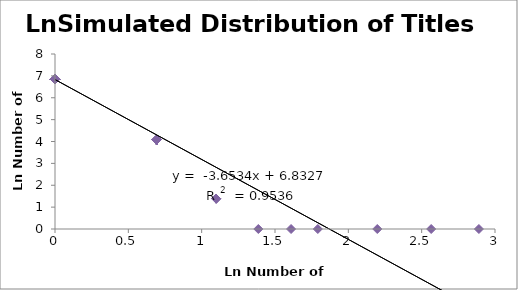
| Category | LnSimulated Number of Athletes |
|---|---|
| 2.8903717578961645 | 0 |
| 2.5649493574615367 | 0 |
| 2.1972245773362196 | 0 |
| 1.791759469228055 | 0 |
| 1.6094379124341003 | 0 |
| 1.3862943611198906 | 0 |
| 1.0986122886681098 | 1.386 |
| 1.0986122886681098 | 1.386 |
| 1.0986122886681098 | 1.386 |
| 1.0986122886681098 | 1.386 |
| 0.6931471805599453 | 4.078 |
| 0.6931471805599453 | 4.078 |
| 0.6931471805599453 | 4.078 |
| 0.6931471805599453 | 4.078 |
| 0.6931471805599453 | 4.078 |
| 0.6931471805599453 | 4.078 |
| 0.6931471805599453 | 4.078 |
| 0.6931471805599453 | 4.078 |
| 0.6931471805599453 | 4.078 |
| 0.6931471805599453 | 4.078 |
| 0.6931471805599453 | 4.078 |
| 0.6931471805599453 | 4.078 |
| 0.6931471805599453 | 4.078 |
| 0.6931471805599453 | 4.078 |
| 0.6931471805599453 | 4.078 |
| 0.6931471805599453 | 4.078 |
| 0.6931471805599453 | 4.078 |
| 0.6931471805599453 | 4.078 |
| 0.6931471805599453 | 4.078 |
| 0.6931471805599453 | 4.078 |
| 0.6931471805599453 | 4.078 |
| 0.6931471805599453 | 4.078 |
| 0.6931471805599453 | 4.078 |
| 0.6931471805599453 | 4.078 |
| 0.6931471805599453 | 4.078 |
| 0.6931471805599453 | 4.078 |
| 0.6931471805599453 | 4.078 |
| 0.6931471805599453 | 4.078 |
| 0.6931471805599453 | 4.078 |
| 0.6931471805599453 | 4.078 |
| 0.6931471805599453 | 4.078 |
| 0.6931471805599453 | 4.078 |
| 0.6931471805599453 | 4.078 |
| 0.6931471805599453 | 4.078 |
| 0.6931471805599453 | 4.078 |
| 0.6931471805599453 | 4.078 |
| 0.6931471805599453 | 4.078 |
| 0.6931471805599453 | 4.078 |
| 0.6931471805599453 | 4.078 |
| 0.6931471805599453 | 4.078 |
| 0.6931471805599453 | 4.078 |
| 0.6931471805599453 | 4.078 |
| 0.6931471805599453 | 4.078 |
| 0.6931471805599453 | 4.078 |
| 0.6931471805599453 | 4.078 |
| 0.6931471805599453 | 4.078 |
| 0.6931471805599453 | 4.078 |
| 0.6931471805599453 | 4.078 |
| 0.6931471805599453 | 4.078 |
| 0.6931471805599453 | 4.078 |
| 0.6931471805599453 | 4.078 |
| 0.6931471805599453 | 4.078 |
| 0.6931471805599453 | 4.078 |
| 0.6931471805599453 | 4.078 |
| 0.6931471805599453 | 4.078 |
| 0.6931471805599453 | 4.078 |
| 0.6931471805599453 | 4.078 |
| 0.6931471805599453 | 4.078 |
| 0.6931471805599453 | 4.078 |
| 0.0 | 6.848 |
| 0.0 | 6.848 |
| 0.0 | 6.848 |
| 0.0 | 6.848 |
| 0.0 | 6.848 |
| 0.0 | 6.848 |
| 0.0 | 6.848 |
| 0.0 | 6.848 |
| 0.0 | 6.848 |
| 0.0 | 6.848 |
| 0.0 | 6.848 |
| 0.0 | 6.848 |
| 0.0 | 6.848 |
| 0.0 | 6.848 |
| 0.0 | 6.848 |
| 0.0 | 6.848 |
| 0.0 | 6.848 |
| 0.0 | 6.848 |
| 0.0 | 6.848 |
| 0.0 | 6.848 |
| 0.0 | 6.848 |
| 0.0 | 6.848 |
| 0.0 | 6.848 |
| 0.0 | 6.848 |
| 0.0 | 6.848 |
| 0.0 | 6.848 |
| 0.0 | 6.848 |
| 0.0 | 6.848 |
| 0.0 | 6.848 |
| 0.0 | 6.848 |
| 0.0 | 6.848 |
| 0.0 | 6.848 |
| 0.0 | 6.848 |
| 0.0 | 6.848 |
| 0.0 | 6.848 |
| 0.0 | 6.848 |
| 0.0 | 6.848 |
| 0.0 | 6.848 |
| 0.0 | 6.848 |
| 0.0 | 6.848 |
| 0.0 | 6.848 |
| 0.0 | 6.848 |
| 0.0 | 6.848 |
| 0.0 | 6.848 |
| 0.0 | 6.848 |
| 0.0 | 6.848 |
| 0.0 | 6.848 |
| 0.0 | 6.848 |
| 0.0 | 6.848 |
| 0.0 | 6.848 |
| 0.0 | 6.848 |
| 0.0 | 6.848 |
| 0.0 | 6.848 |
| 0.0 | 6.848 |
| 0.0 | 6.848 |
| 0.0 | 6.848 |
| 0.0 | 6.848 |
| 0.0 | 6.848 |
| 0.0 | 6.848 |
| 0.0 | 6.848 |
| 0.0 | 6.848 |
| 0.0 | 6.848 |
| 0.0 | 6.848 |
| 0.0 | 6.848 |
| 0.0 | 6.848 |
| 0.0 | 6.848 |
| 0.0 | 6.848 |
| 0.0 | 6.848 |
| 0.0 | 6.848 |
| 0.0 | 6.848 |
| 0.0 | 6.848 |
| 0.0 | 6.848 |
| 0.0 | 6.848 |
| 0.0 | 6.848 |
| 0.0 | 6.848 |
| 0.0 | 6.848 |
| 0.0 | 6.848 |
| 0.0 | 6.848 |
| 0.0 | 6.848 |
| 0.0 | 6.848 |
| 0.0 | 6.848 |
| 0.0 | 6.848 |
| 0.0 | 6.848 |
| 0.0 | 6.848 |
| 0.0 | 6.848 |
| 0.0 | 6.848 |
| 0.0 | 6.848 |
| 0.0 | 6.848 |
| 0.0 | 6.848 |
| 0.0 | 6.848 |
| 0.0 | 6.848 |
| 0.0 | 6.848 |
| 0.0 | 6.848 |
| 0.0 | 6.848 |
| 0.0 | 6.848 |
| 0.0 | 6.848 |
| 0.0 | 6.848 |
| 0.0 | 6.848 |
| 0.0 | 6.848 |
| 0.0 | 6.848 |
| 0.0 | 6.848 |
| 0.0 | 6.848 |
| 0.0 | 6.848 |
| 0.0 | 6.848 |
| 0.0 | 6.848 |
| 0.0 | 6.848 |
| 0.0 | 6.848 |
| 0.0 | 6.848 |
| 0.0 | 6.848 |
| 0.0 | 6.848 |
| 0.0 | 6.848 |
| 0.0 | 6.848 |
| 0.0 | 6.848 |
| 0.0 | 6.848 |
| 0.0 | 6.848 |
| 0.0 | 6.848 |
| 0.0 | 6.848 |
| 0.0 | 6.848 |
| 0.0 | 6.848 |
| 0.0 | 6.848 |
| 0.0 | 6.848 |
| 0.0 | 6.848 |
| 0.0 | 6.848 |
| 0.0 | 6.848 |
| 0.0 | 6.848 |
| 0.0 | 6.848 |
| 0.0 | 6.848 |
| 0.0 | 6.848 |
| 0.0 | 6.848 |
| 0.0 | 6.848 |
| 0.0 | 6.848 |
| 0.0 | 6.848 |
| 0.0 | 6.848 |
| 0.0 | 6.848 |
| 0.0 | 6.848 |
| 0.0 | 6.848 |
| 0.0 | 6.848 |
| 0.0 | 6.848 |
| 0.0 | 6.848 |
| 0.0 | 6.848 |
| 0.0 | 6.848 |
| 0.0 | 6.848 |
| 0.0 | 6.848 |
| 0.0 | 6.848 |
| 0.0 | 6.848 |
| 0.0 | 6.848 |
| 0.0 | 6.848 |
| 0.0 | 6.848 |
| 0.0 | 6.848 |
| 0.0 | 6.848 |
| 0.0 | 6.848 |
| 0.0 | 6.848 |
| 0.0 | 6.848 |
| 0.0 | 6.848 |
| 0.0 | 6.848 |
| 0.0 | 6.848 |
| 0.0 | 6.848 |
| 0.0 | 6.848 |
| 0.0 | 6.848 |
| 0.0 | 6.848 |
| 0.0 | 6.848 |
| 0.0 | 6.848 |
| 0.0 | 6.848 |
| 0.0 | 6.848 |
| 0.0 | 6.848 |
| 0.0 | 6.848 |
| 0.0 | 6.848 |
| 0.0 | 6.848 |
| 0.0 | 6.848 |
| 0.0 | 6.848 |
| 0.0 | 6.848 |
| 0.0 | 6.848 |
| 0.0 | 6.848 |
| 0.0 | 6.848 |
| 0.0 | 6.848 |
| 0.0 | 6.848 |
| 0.0 | 6.848 |
| 0.0 | 6.848 |
| 0.0 | 6.848 |
| 0.0 | 6.848 |
| 0.0 | 6.848 |
| 0.0 | 6.848 |
| 0.0 | 6.848 |
| 0.0 | 6.848 |
| 0.0 | 6.848 |
| 0.0 | 6.848 |
| 0.0 | 6.848 |
| 0.0 | 6.848 |
| 0.0 | 6.848 |
| 0.0 | 6.848 |
| 0.0 | 6.848 |
| 0.0 | 6.848 |
| 0.0 | 6.848 |
| 0.0 | 6.848 |
| 0.0 | 6.848 |
| 0.0 | 6.848 |
| 0.0 | 6.848 |
| 0.0 | 6.848 |
| 0.0 | 6.848 |
| 0.0 | 6.848 |
| 0.0 | 6.848 |
| 0.0 | 6.848 |
| 0.0 | 6.848 |
| 0.0 | 6.848 |
| 0.0 | 6.848 |
| 0.0 | 6.848 |
| 0.0 | 6.848 |
| 0.0 | 6.848 |
| 0.0 | 6.848 |
| 0.0 | 6.848 |
| 0.0 | 6.848 |
| 0.0 | 6.848 |
| 0.0 | 6.848 |
| 0.0 | 6.848 |
| 0.0 | 6.848 |
| 0.0 | 6.848 |
| 0.0 | 6.848 |
| 0.0 | 6.848 |
| 0.0 | 6.848 |
| 0.0 | 6.848 |
| 0.0 | 6.848 |
| 0.0 | 6.848 |
| 0.0 | 6.848 |
| 0.0 | 6.848 |
| 0.0 | 6.848 |
| 0.0 | 6.848 |
| 0.0 | 6.848 |
| 0.0 | 6.848 |
| 0.0 | 6.848 |
| 0.0 | 6.848 |
| 0.0 | 6.848 |
| 0.0 | 6.848 |
| 0.0 | 6.848 |
| 0.0 | 6.848 |
| 0.0 | 6.848 |
| 0.0 | 6.848 |
| 0.0 | 6.848 |
| 0.0 | 6.848 |
| 0.0 | 6.848 |
| 0.0 | 6.848 |
| 0.0 | 6.848 |
| 0.0 | 6.848 |
| 0.0 | 6.848 |
| 0.0 | 6.848 |
| 0.0 | 6.848 |
| 0.0 | 6.848 |
| 0.0 | 6.848 |
| 0.0 | 6.848 |
| 0.0 | 6.848 |
| 0.0 | 6.848 |
| 0.0 | 6.848 |
| 0.0 | 6.848 |
| 0.0 | 6.848 |
| 0.0 | 6.848 |
| 0.0 | 6.848 |
| 0.0 | 6.848 |
| 0.0 | 6.848 |
| 0.0 | 6.848 |
| 0.0 | 6.848 |
| 0.0 | 6.848 |
| 0.0 | 6.848 |
| 0.0 | 6.848 |
| 0.0 | 6.848 |
| 0.0 | 6.848 |
| 0.0 | 6.848 |
| 0.0 | 6.848 |
| 0.0 | 6.848 |
| 0.0 | 6.848 |
| 0.0 | 6.848 |
| 0.0 | 6.848 |
| 0.0 | 6.848 |
| 0.0 | 6.848 |
| 0.0 | 6.848 |
| 0.0 | 6.848 |
| 0.0 | 6.848 |
| 0.0 | 6.848 |
| 0.0 | 6.848 |
| 0.0 | 6.848 |
| 0.0 | 6.848 |
| 0.0 | 6.848 |
| 0.0 | 6.848 |
| 0.0 | 6.848 |
| 0.0 | 6.848 |
| 0.0 | 6.848 |
| 0.0 | 6.848 |
| 0.0 | 6.848 |
| 0.0 | 6.848 |
| 0.0 | 6.848 |
| 0.0 | 6.848 |
| 0.0 | 6.848 |
| 0.0 | 6.848 |
| 0.0 | 6.848 |
| 0.0 | 6.848 |
| 0.0 | 6.848 |
| 0.0 | 6.848 |
| 0.0 | 6.848 |
| 0.0 | 6.848 |
| 0.0 | 6.848 |
| 0.0 | 6.848 |
| 0.0 | 6.848 |
| 0.0 | 6.848 |
| 0.0 | 6.848 |
| 0.0 | 6.848 |
| 0.0 | 6.848 |
| 0.0 | 6.848 |
| 0.0 | 6.848 |
| 0.0 | 6.848 |
| 0.0 | 6.848 |
| 0.0 | 6.848 |
| 0.0 | 6.848 |
| 0.0 | 6.848 |
| 0.0 | 6.848 |
| 0.0 | 6.848 |
| 0.0 | 6.848 |
| 0.0 | 6.848 |
| 0.0 | 6.848 |
| 0.0 | 6.848 |
| 0.0 | 6.848 |
| 0.0 | 6.848 |
| 0.0 | 6.848 |
| 0.0 | 6.848 |
| 0.0 | 6.848 |
| 0.0 | 6.848 |
| 0.0 | 6.848 |
| 0.0 | 6.848 |
| 0.0 | 6.848 |
| 0.0 | 6.848 |
| 0.0 | 6.848 |
| 0.0 | 6.848 |
| 0.0 | 6.848 |
| 0.0 | 6.848 |
| 0.0 | 6.848 |
| 0.0 | 6.848 |
| 0.0 | 6.848 |
| 0.0 | 6.848 |
| 0.0 | 6.848 |
| 0.0 | 6.848 |
| 0.0 | 6.848 |
| 0.0 | 6.848 |
| 0.0 | 6.848 |
| 0.0 | 6.848 |
| 0.0 | 6.848 |
| 0.0 | 6.848 |
| 0.0 | 6.848 |
| 0.0 | 6.848 |
| 0.0 | 6.848 |
| 0.0 | 6.848 |
| 0.0 | 6.848 |
| 0.0 | 6.848 |
| 0.0 | 6.848 |
| 0.0 | 6.848 |
| 0.0 | 6.848 |
| 0.0 | 6.848 |
| 0.0 | 6.848 |
| 0.0 | 6.848 |
| 0.0 | 6.848 |
| 0.0 | 6.848 |
| 0.0 | 6.848 |
| 0.0 | 6.848 |
| 0.0 | 6.848 |
| 0.0 | 6.848 |
| 0.0 | 6.848 |
| 0.0 | 6.848 |
| 0.0 | 6.848 |
| 0.0 | 6.848 |
| 0.0 | 6.848 |
| 0.0 | 6.848 |
| 0.0 | 6.848 |
| 0.0 | 6.848 |
| 0.0 | 6.848 |
| 0.0 | 6.848 |
| 0.0 | 6.848 |
| 0.0 | 6.848 |
| 0.0 | 6.848 |
| 0.0 | 6.848 |
| 0.0 | 6.848 |
| 0.0 | 6.848 |
| 0.0 | 6.848 |
| 0.0 | 6.848 |
| 0.0 | 6.848 |
| 0.0 | 6.848 |
| 0.0 | 6.848 |
| 0.0 | 6.848 |
| 0.0 | 6.848 |
| 0.0 | 6.848 |
| 0.0 | 6.848 |
| 0.0 | 6.848 |
| 0.0 | 6.848 |
| 0.0 | 6.848 |
| 0.0 | 6.848 |
| 0.0 | 6.848 |
| 0.0 | 6.848 |
| 0.0 | 6.848 |
| 0.0 | 6.848 |
| 0.0 | 6.848 |
| 0.0 | 6.848 |
| 0.0 | 6.848 |
| 0.0 | 6.848 |
| 0.0 | 6.848 |
| 0.0 | 6.848 |
| 0.0 | 6.848 |
| 0.0 | 6.848 |
| 0.0 | 6.848 |
| 0.0 | 6.848 |
| 0.0 | 6.848 |
| 0.0 | 6.848 |
| 0.0 | 6.848 |
| 0.0 | 6.848 |
| 0.0 | 6.848 |
| 0.0 | 6.848 |
| 0.0 | 6.848 |
| 0.0 | 6.848 |
| 0.0 | 6.848 |
| 0.0 | 6.848 |
| 0.0 | 6.848 |
| 0.0 | 6.848 |
| 0.0 | 6.848 |
| 0.0 | 6.848 |
| 0.0 | 6.848 |
| 0.0 | 6.848 |
| 0.0 | 6.848 |
| 0.0 | 6.848 |
| 0.0 | 6.848 |
| 0.0 | 6.848 |
| 0.0 | 6.848 |
| 0.0 | 6.848 |
| 0.0 | 6.848 |
| 0.0 | 6.848 |
| 0.0 | 6.848 |
| 0.0 | 6.848 |
| 0.0 | 6.848 |
| 0.0 | 6.848 |
| 0.0 | 6.848 |
| 0.0 | 6.848 |
| 0.0 | 6.848 |
| 0.0 | 6.848 |
| 0.0 | 6.848 |
| 0.0 | 6.848 |
| 0.0 | 6.848 |
| 0.0 | 6.848 |
| 0.0 | 6.848 |
| 0.0 | 6.848 |
| 0.0 | 6.848 |
| 0.0 | 6.848 |
| 0.0 | 6.848 |
| 0.0 | 6.848 |
| 0.0 | 6.848 |
| 0.0 | 6.848 |
| 0.0 | 6.848 |
| 0.0 | 6.848 |
| 0.0 | 6.848 |
| 0.0 | 6.848 |
| 0.0 | 6.848 |
| 0.0 | 6.848 |
| 0.0 | 6.848 |
| 0.0 | 6.848 |
| 0.0 | 6.848 |
| 0.0 | 6.848 |
| 0.0 | 6.848 |
| 0.0 | 6.848 |
| 0.0 | 6.848 |
| 0.0 | 6.848 |
| 0.0 | 6.848 |
| 0.0 | 6.848 |
| 0.0 | 6.848 |
| 0.0 | 6.848 |
| 0.0 | 6.848 |
| 0.0 | 6.848 |
| 0.0 | 6.848 |
| 0.0 | 6.848 |
| 0.0 | 6.848 |
| 0.0 | 6.848 |
| 0.0 | 6.848 |
| 0.0 | 6.848 |
| 0.0 | 6.848 |
| 0.0 | 6.848 |
| 0.0 | 6.848 |
| 0.0 | 6.848 |
| 0.0 | 6.848 |
| 0.0 | 6.848 |
| 0.0 | 6.848 |
| 0.0 | 6.848 |
| 0.0 | 6.848 |
| 0.0 | 6.848 |
| 0.0 | 6.848 |
| 0.0 | 6.848 |
| 0.0 | 6.848 |
| 0.0 | 6.848 |
| 0.0 | 6.848 |
| 0.0 | 6.848 |
| 0.0 | 6.848 |
| 0.0 | 6.848 |
| 0.0 | 6.848 |
| 0.0 | 6.848 |
| 0.0 | 6.848 |
| 0.0 | 6.848 |
| 0.0 | 6.848 |
| 0.0 | 6.848 |
| 0.0 | 6.848 |
| 0.0 | 6.848 |
| 0.0 | 6.848 |
| 0.0 | 6.848 |
| 0.0 | 6.848 |
| 0.0 | 6.848 |
| 0.0 | 6.848 |
| 0.0 | 6.848 |
| 0.0 | 6.848 |
| 0.0 | 6.848 |
| 0.0 | 6.848 |
| 0.0 | 6.848 |
| 0.0 | 6.848 |
| 0.0 | 6.848 |
| 0.0 | 6.848 |
| 0.0 | 6.848 |
| 0.0 | 6.848 |
| 0.0 | 6.848 |
| 0.0 | 6.848 |
| 0.0 | 6.848 |
| 0.0 | 6.848 |
| 0.0 | 6.848 |
| 0.0 | 6.848 |
| 0.0 | 6.848 |
| 0.0 | 6.848 |
| 0.0 | 6.848 |
| 0.0 | 6.848 |
| 0.0 | 6.848 |
| 0.0 | 6.848 |
| 0.0 | 6.848 |
| 0.0 | 6.848 |
| 0.0 | 6.848 |
| 0.0 | 6.848 |
| 0.0 | 6.848 |
| 0.0 | 6.848 |
| 0.0 | 6.848 |
| 0.0 | 6.848 |
| 0.0 | 6.848 |
| 0.0 | 6.848 |
| 0.0 | 6.848 |
| 0.0 | 6.848 |
| 0.0 | 6.848 |
| 0.0 | 6.848 |
| 0.0 | 6.848 |
| 0.0 | 6.848 |
| 0.0 | 6.848 |
| 0.0 | 6.848 |
| 0.0 | 6.848 |
| 0.0 | 6.848 |
| 0.0 | 6.848 |
| 0.0 | 6.848 |
| 0.0 | 6.848 |
| 0.0 | 6.848 |
| 0.0 | 6.848 |
| 0.0 | 6.848 |
| 0.0 | 6.848 |
| 0.0 | 6.848 |
| 0.0 | 6.848 |
| 0.0 | 6.848 |
| 0.0 | 6.848 |
| 0.0 | 6.848 |
| 0.0 | 6.848 |
| 0.0 | 6.848 |
| 0.0 | 6.848 |
| 0.0 | 6.848 |
| 0.0 | 6.848 |
| 0.0 | 6.848 |
| 0.0 | 6.848 |
| 0.0 | 6.848 |
| 0.0 | 6.848 |
| 0.0 | 6.848 |
| 0.0 | 6.848 |
| 0.0 | 6.848 |
| 0.0 | 6.848 |
| 0.0 | 6.848 |
| 0.0 | 6.848 |
| 0.0 | 6.848 |
| 0.0 | 6.848 |
| 0.0 | 6.848 |
| 0.0 | 6.848 |
| 0.0 | 6.848 |
| 0.0 | 6.848 |
| 0.0 | 6.848 |
| 0.0 | 6.848 |
| 0.0 | 6.848 |
| 0.0 | 6.848 |
| 0.0 | 6.848 |
| 0.0 | 6.848 |
| 0.0 | 6.848 |
| 0.0 | 6.848 |
| 0.0 | 6.848 |
| 0.0 | 6.848 |
| 0.0 | 6.848 |
| 0.0 | 6.848 |
| 0.0 | 6.848 |
| 0.0 | 6.848 |
| 0.0 | 6.848 |
| 0.0 | 6.848 |
| 0.0 | 6.848 |
| 0.0 | 6.848 |
| 0.0 | 6.848 |
| 0.0 | 6.848 |
| 0.0 | 6.848 |
| 0.0 | 6.848 |
| 0.0 | 6.848 |
| 0.0 | 6.848 |
| 0.0 | 6.848 |
| 0.0 | 6.848 |
| 0.0 | 6.848 |
| 0.0 | 6.848 |
| 0.0 | 6.848 |
| 0.0 | 6.848 |
| 0.0 | 6.848 |
| 0.0 | 6.848 |
| 0.0 | 6.848 |
| 0.0 | 6.848 |
| 0.0 | 6.848 |
| 0.0 | 6.848 |
| 0.0 | 6.848 |
| 0.0 | 6.848 |
| 0.0 | 6.848 |
| 0.0 | 6.848 |
| 0.0 | 6.848 |
| 0.0 | 6.848 |
| 0.0 | 6.848 |
| 0.0 | 6.848 |
| 0.0 | 6.848 |
| 0.0 | 6.848 |
| 0.0 | 6.848 |
| 0.0 | 6.848 |
| 0.0 | 6.848 |
| 0.0 | 6.848 |
| 0.0 | 6.848 |
| 0.0 | 6.848 |
| 0.0 | 6.848 |
| 0.0 | 6.848 |
| 0.0 | 6.848 |
| 0.0 | 6.848 |
| 0.0 | 6.848 |
| 0.0 | 6.848 |
| 0.0 | 6.848 |
| 0.0 | 6.848 |
| 0.0 | 6.848 |
| 0.0 | 6.848 |
| 0.0 | 6.848 |
| 0.0 | 6.848 |
| 0.0 | 6.848 |
| 0.0 | 6.848 |
| 0.0 | 6.848 |
| 0.0 | 6.848 |
| 0.0 | 6.848 |
| 0.0 | 6.848 |
| 0.0 | 6.848 |
| 0.0 | 6.848 |
| 0.0 | 6.848 |
| 0.0 | 6.848 |
| 0.0 | 6.848 |
| 0.0 | 6.848 |
| 0.0 | 6.848 |
| 0.0 | 6.848 |
| 0.0 | 6.848 |
| 0.0 | 6.848 |
| 0.0 | 6.848 |
| 0.0 | 6.848 |
| 0.0 | 6.848 |
| 0.0 | 6.848 |
| 0.0 | 6.848 |
| 0.0 | 6.848 |
| 0.0 | 6.848 |
| 0.0 | 6.848 |
| 0.0 | 6.848 |
| 0.0 | 6.848 |
| 0.0 | 6.848 |
| 0.0 | 6.848 |
| 0.0 | 6.848 |
| 0.0 | 6.848 |
| 0.0 | 6.848 |
| 0.0 | 6.848 |
| 0.0 | 6.848 |
| 0.0 | 6.848 |
| 0.0 | 6.848 |
| 0.0 | 6.848 |
| 0.0 | 6.848 |
| 0.0 | 6.848 |
| 0.0 | 6.848 |
| 0.0 | 6.848 |
| 0.0 | 6.848 |
| 0.0 | 6.848 |
| 0.0 | 6.848 |
| 0.0 | 6.848 |
| 0.0 | 6.848 |
| 0.0 | 6.848 |
| 0.0 | 6.848 |
| 0.0 | 6.848 |
| 0.0 | 6.848 |
| 0.0 | 6.848 |
| 0.0 | 6.848 |
| 0.0 | 6.848 |
| 0.0 | 6.848 |
| 0.0 | 6.848 |
| 0.0 | 6.848 |
| 0.0 | 6.848 |
| 0.0 | 6.848 |
| 0.0 | 6.848 |
| 0.0 | 6.848 |
| 0.0 | 6.848 |
| 0.0 | 6.848 |
| 0.0 | 6.848 |
| 0.0 | 6.848 |
| 0.0 | 6.848 |
| 0.0 | 6.848 |
| 0.0 | 6.848 |
| 0.0 | 6.848 |
| 0.0 | 6.848 |
| 0.0 | 6.848 |
| 0.0 | 6.848 |
| 0.0 | 6.848 |
| 0.0 | 6.848 |
| 0.0 | 6.848 |
| 0.0 | 6.848 |
| 0.0 | 6.848 |
| 0.0 | 6.848 |
| 0.0 | 6.848 |
| 0.0 | 6.848 |
| 0.0 | 6.848 |
| 0.0 | 6.848 |
| 0.0 | 6.848 |
| 0.0 | 6.848 |
| 0.0 | 6.848 |
| 0.0 | 6.848 |
| 0.0 | 6.848 |
| 0.0 | 6.848 |
| 0.0 | 6.848 |
| 0.0 | 6.848 |
| 0.0 | 6.848 |
| 0.0 | 6.848 |
| 0.0 | 6.848 |
| 0.0 | 6.848 |
| 0.0 | 6.848 |
| 0.0 | 6.848 |
| 0.0 | 6.848 |
| 0.0 | 6.848 |
| 0.0 | 6.848 |
| 0.0 | 6.848 |
| 0.0 | 6.848 |
| 0.0 | 6.848 |
| 0.0 | 6.848 |
| 0.0 | 6.848 |
| 0.0 | 6.848 |
| 0.0 | 6.848 |
| 0.0 | 6.848 |
| 0.0 | 6.848 |
| 0.0 | 6.848 |
| 0.0 | 6.848 |
| 0.0 | 6.848 |
| 0.0 | 6.848 |
| 0.0 | 6.848 |
| 0.0 | 6.848 |
| 0.0 | 6.848 |
| 0.0 | 6.848 |
| 0.0 | 6.848 |
| 0.0 | 6.848 |
| 0.0 | 6.848 |
| 0.0 | 6.848 |
| 0.0 | 6.848 |
| 0.0 | 6.848 |
| 0.0 | 6.848 |
| 0.0 | 6.848 |
| 0.0 | 6.848 |
| 0.0 | 6.848 |
| 0.0 | 6.848 |
| 0.0 | 6.848 |
| 0.0 | 6.848 |
| 0.0 | 6.848 |
| 0.0 | 6.848 |
| 0.0 | 6.848 |
| 0.0 | 6.848 |
| 0.0 | 6.848 |
| 0.0 | 6.848 |
| 0.0 | 6.848 |
| 0.0 | 6.848 |
| 0.0 | 6.848 |
| 0.0 | 6.848 |
| 0.0 | 6.848 |
| 0.0 | 6.848 |
| 0.0 | 6.848 |
| 0.0 | 6.848 |
| 0.0 | 6.848 |
| 0.0 | 6.848 |
| 0.0 | 6.848 |
| 0.0 | 6.848 |
| 0.0 | 6.848 |
| 0.0 | 6.848 |
| 0.0 | 6.848 |
| 0.0 | 6.848 |
| 0.0 | 6.848 |
| 0.0 | 6.848 |
| 0.0 | 6.848 |
| 0.0 | 6.848 |
| 0.0 | 6.848 |
| 0.0 | 6.848 |
| 0.0 | 6.848 |
| 0.0 | 6.848 |
| 0.0 | 6.848 |
| 0.0 | 6.848 |
| 0.0 | 6.848 |
| 0.0 | 6.848 |
| 0.0 | 6.848 |
| 0.0 | 6.848 |
| 0.0 | 6.848 |
| 0.0 | 6.848 |
| 0.0 | 6.848 |
| 0.0 | 6.848 |
| 0.0 | 6.848 |
| 0.0 | 6.848 |
| 0.0 | 6.848 |
| 0.0 | 6.848 |
| 0.0 | 6.848 |
| 0.0 | 6.848 |
| 0.0 | 6.848 |
| 0.0 | 6.848 |
| 0.0 | 6.848 |
| 0.0 | 6.848 |
| 0.0 | 6.848 |
| 0.0 | 6.848 |
| 0.0 | 6.848 |
| 0.0 | 6.848 |
| 0.0 | 6.848 |
| 0.0 | 6.848 |
| 0.0 | 6.848 |
| 0.0 | 6.848 |
| 0.0 | 6.848 |
| 0.0 | 6.848 |
| 0.0 | 6.848 |
| 0.0 | 6.848 |
| 0.0 | 6.848 |
| 0.0 | 6.848 |
| 0.0 | 6.848 |
| 0.0 | 6.848 |
| 0.0 | 6.848 |
| 0.0 | 6.848 |
| 0.0 | 6.848 |
| 0.0 | 6.848 |
| 0.0 | 6.848 |
| 0.0 | 6.848 |
| 0.0 | 6.848 |
| 0.0 | 6.848 |
| 0.0 | 6.848 |
| 0.0 | 6.848 |
| 0.0 | 6.848 |
| 0.0 | 6.848 |
| 0.0 | 6.848 |
| 0.0 | 6.848 |
| 0.0 | 6.848 |
| 0.0 | 6.848 |
| 0.0 | 6.848 |
| 0.0 | 6.848 |
| 0.0 | 6.848 |
| 0.0 | 6.848 |
| 0.0 | 6.848 |
| 0.0 | 6.848 |
| 0.0 | 6.848 |
| 0.0 | 6.848 |
| 0.0 | 6.848 |
| 0.0 | 6.848 |
| 0.0 | 6.848 |
| 0.0 | 6.848 |
| 0.0 | 6.848 |
| 0.0 | 6.848 |
| 0.0 | 6.848 |
| 0.0 | 6.848 |
| 0.0 | 6.848 |
| 0.0 | 6.848 |
| 0.0 | 6.848 |
| 0.0 | 6.848 |
| 0.0 | 6.848 |
| 0.0 | 6.848 |
| 0.0 | 6.848 |
| 0.0 | 6.848 |
| 0.0 | 6.848 |
| 0.0 | 6.848 |
| 0.0 | 6.848 |
| 0.0 | 6.848 |
| 0.0 | 6.848 |
| 0.0 | 6.848 |
| 0.0 | 6.848 |
| 0.0 | 6.848 |
| 0.0 | 6.848 |
| 0.0 | 6.848 |
| 0.0 | 6.848 |
| 0.0 | 6.848 |
| 0.0 | 6.848 |
| 0.0 | 6.848 |
| 0.0 | 6.848 |
| 0.0 | 6.848 |
| 0.0 | 6.848 |
| 0.0 | 6.848 |
| 0.0 | 6.848 |
| 0.0 | 6.848 |
| 0.0 | 6.848 |
| 0.0 | 6.848 |
| 0.0 | 6.848 |
| 0.0 | 6.848 |
| 0.0 | 6.848 |
| 0.0 | 6.848 |
| 0.0 | 6.848 |
| 0.0 | 6.848 |
| 0.0 | 6.848 |
| 0.0 | 6.848 |
| 0.0 | 6.848 |
| 0.0 | 6.848 |
| 0.0 | 6.848 |
| 0.0 | 6.848 |
| 0.0 | 6.848 |
| 0.0 | 6.848 |
| 0.0 | 6.848 |
| 0.0 | 6.848 |
| 0.0 | 6.848 |
| 0.0 | 6.848 |
| 0.0 | 6.848 |
| 0.0 | 6.848 |
| 0.0 | 6.848 |
| 0.0 | 6.848 |
| 0.0 | 6.848 |
| 0.0 | 6.848 |
| 0.0 | 6.848 |
| 0.0 | 6.848 |
| 0.0 | 6.848 |
| 0.0 | 6.848 |
| 0.0 | 6.848 |
| 0.0 | 6.848 |
| 0.0 | 6.848 |
| 0.0 | 6.848 |
| 0.0 | 6.848 |
| 0.0 | 6.848 |
| 0.0 | 6.848 |
| 0.0 | 6.848 |
| 0.0 | 6.848 |
| 0.0 | 6.848 |
| 0.0 | 6.848 |
| 0.0 | 6.848 |
| 0.0 | 6.848 |
| 0.0 | 6.848 |
| 0.0 | 6.848 |